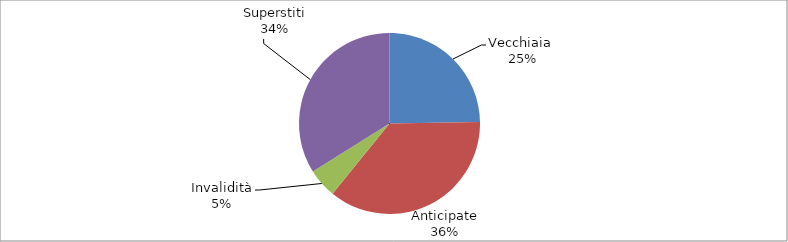
| Category | Series 0 |
|---|---|
| Vecchiaia  | 16355 |
| Anticipate | 23851 |
| Invalidità | 3477 |
| Superstiti | 22405 |